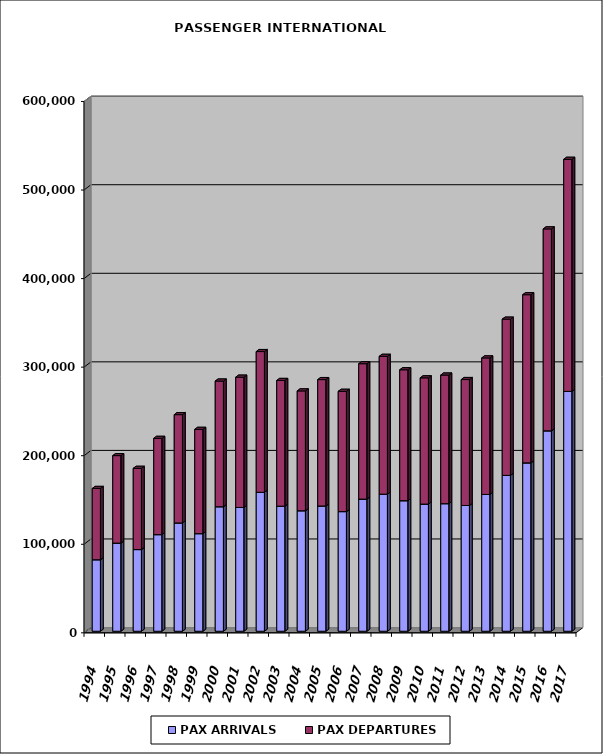
| Category | PAX ARRIVALS | PAX DEPARTURES |
|---|---|---|
| 1994.0 | 80734 | 80495 |
| 1995.0 | 99550 | 98750 |
| 1996.0 | 92225 | 91708 |
| 1997.0 | 109088 | 108686 |
| 1998.0 | 122303 | 122258 |
| 1999.0 | 110199 | 117733 |
| 2000.0 | 140592 | 141890 |
| 2001.0 | 139773 | 147084 |
| 2002.0 | 156879 | 158912 |
| 2003.0 | 141254 | 141908 |
| 2004.0 | 136061 | 135301 |
| 2005.0 | 141440 | 142712 |
| 2006.0 | 135083 | 135818 |
| 2007.0 | 149231 | 152857 |
| 2008.0 | 154765 | 155639 |
| 2009.0 | 147402 | 147831 |
| 2010.0 | 143597 | 142508 |
| 2011.0 | 144058 | 145207 |
| 2012.0 | 142027 | 142179 |
| 2013.0 | 154489 | 154118 |
| 2014.0 | 175986 | 176398 |
| 2015.0 | 190129 | 189882 |
| 2016.0 | 226308 | 227992 |
| 2017.0 | 270825 | 262054 |